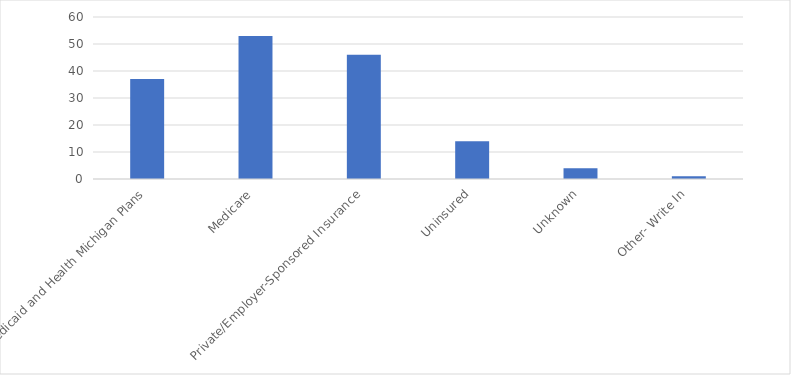
| Category | Number of Responses |
|---|---|
| Medicaid and Health Michigan Plans | 37 |
| Medicare | 53 |
| Private/Employer-Sponsored Insurance | 46 |
| Uninsured | 14 |
| Unknown | 4 |
| Other- Write In | 1 |